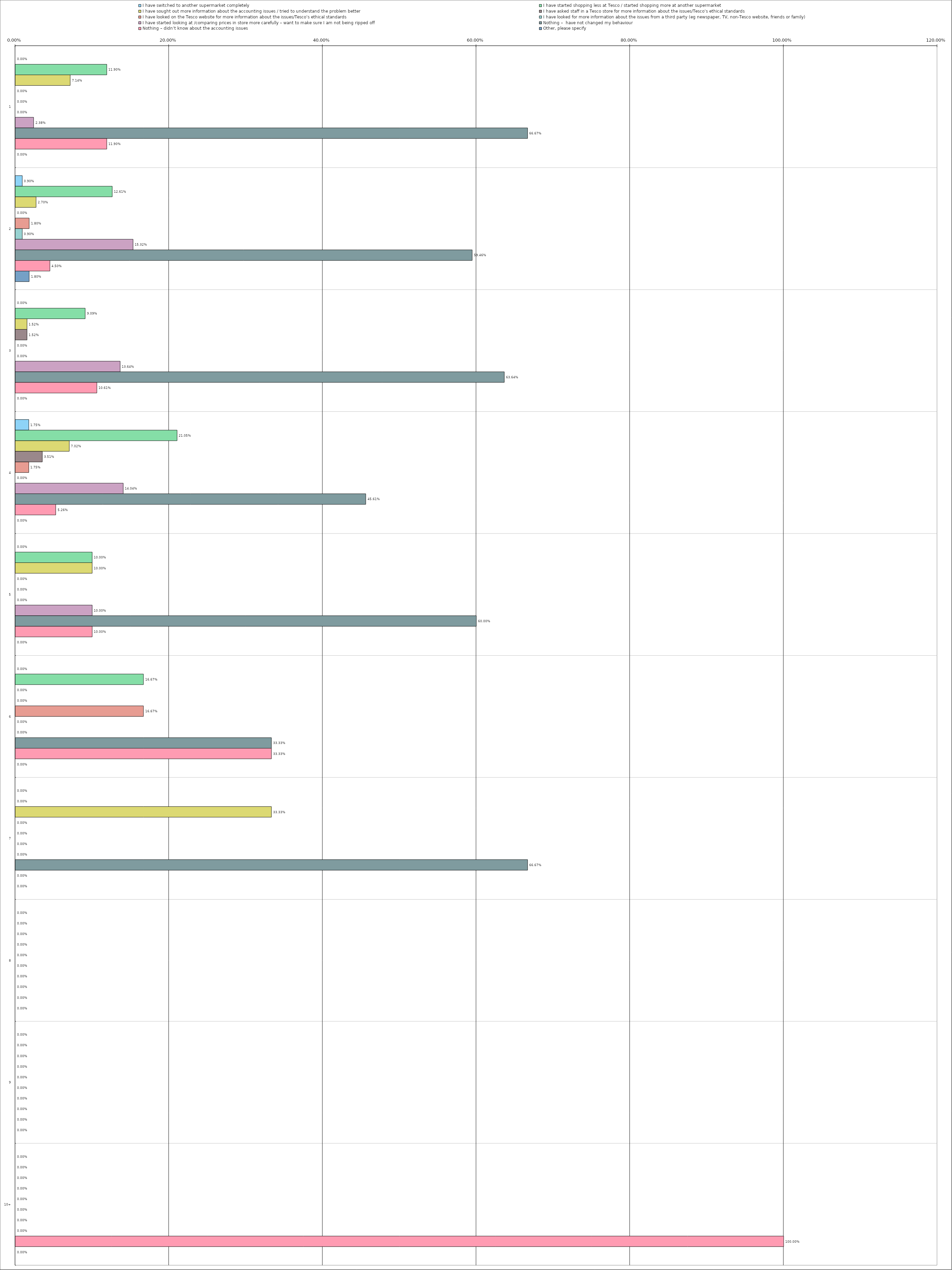
| Category | I have switched to another supermarket completely | I have started shopping less at Tesco / started shopping more at another supermarket | I have sought out more information about the accounting issues / tried to understand the problem better | I have asked staff in a Tesco store for more information about the issues/Tesco’s ethical standards | I have looked on the Tesco website for more information about the issues/Tesco’s ethical standards | I have looked for more information about the issues from a third party (eg newspaper, TV, non-Tesco website, friends or family) | I have started looking at /comparing prices in store more carefully – want to make sure I am not being ripped off | Nothing –  have not changed my behaviour | Nothing – didn’t know about the accounting issues | Other, please specify |
|---|---|---|---|---|---|---|---|---|---|---|
| 0 | 0 | 0.119 | 0.071 | 0 | 0 | 0 | 0.024 | 0.667 | 0.119 | 0 |
| 1 | 0.009 | 0.126 | 0.027 | 0 | 0.018 | 0.009 | 0.153 | 0.595 | 0.045 | 0.018 |
| 2 | 0 | 0.091 | 0.015 | 0.015 | 0 | 0 | 0.136 | 0.636 | 0.106 | 0 |
| 3 | 0.018 | 0.21 | 0.07 | 0.035 | 0.018 | 0 | 0.14 | 0.456 | 0.053 | 0 |
| 4 | 0 | 0.1 | 0.1 | 0 | 0 | 0 | 0.1 | 0.6 | 0.1 | 0 |
| 5 | 0 | 0.167 | 0 | 0 | 0.167 | 0 | 0 | 0.333 | 0.333 | 0 |
| 6 | 0 | 0 | 0.333 | 0 | 0 | 0 | 0 | 0.667 | 0 | 0 |
| 7 | 0 | 0 | 0 | 0 | 0 | 0 | 0 | 0 | 0 | 0 |
| 8 | 0 | 0 | 0 | 0 | 0 | 0 | 0 | 0 | 0 | 0 |
| 9 | 0 | 0 | 0 | 0 | 0 | 0 | 0 | 0 | 1 | 0 |